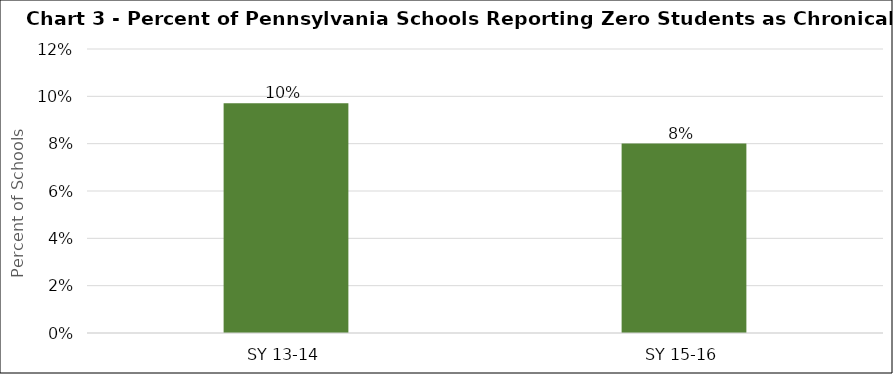
| Category | Series 0 |
|---|---|
| SY 13-14 | 0.097 |
| SY 15-16 | 0.08 |